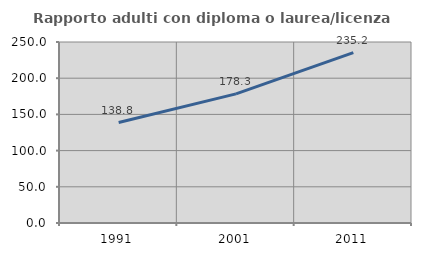
| Category | Rapporto adulti con diploma o laurea/licenza media  |
|---|---|
| 1991.0 | 138.75 |
| 2001.0 | 178.295 |
| 2011.0 | 235.211 |